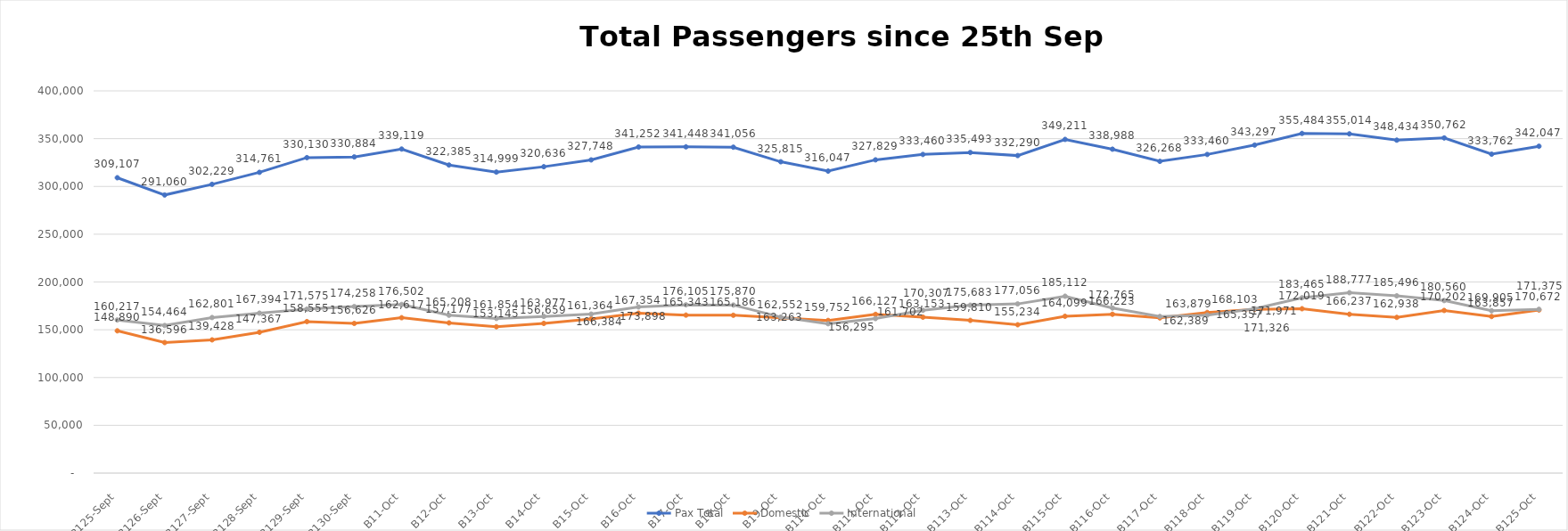
| Category | Pax Total | Domestic | International |
|---|---|---|---|
| 2023-09-25 | 309107 | 148890 | 160217 |
| 2023-09-26 | 291060 | 136596 | 154464 |
| 2023-09-27 | 302229 | 139428 | 162801 |
| 2023-09-28 | 314761 | 147367 | 167394 |
| 2023-09-29 | 330130 | 158555 | 171575 |
| 2023-09-30 | 330884 | 156626 | 174258 |
| 2023-10-01 | 339119 | 162617 | 176502 |
| 2023-10-02 | 322385 | 157177 | 165208 |
| 2023-10-03 | 314999 | 153145 | 161854 |
| 2023-10-04 | 320636 | 156659 | 163977 |
| 2023-10-05 | 327748 | 161364 | 166384 |
| 2023-10-06 | 341252 | 167354 | 173898 |
| 2023-10-07 | 341448 | 165343 | 176105 |
| 2023-10-08 | 341056 | 165186 | 175870 |
| 2023-10-09 | 325815 | 162552 | 163263 |
| 2023-10-10 | 316047 | 159752 | 156295 |
| 2023-10-11 | 327829 | 166127 | 161702 |
| 2023-10-12 | 333460 | 163153 | 170307 |
| 2023-10-13 | 335493 | 159810 | 175683 |
| 2023-10-14 | 332290 | 155234 | 177056 |
| 2023-10-15 | 349211 | 164099 | 185112 |
| 2023-10-16 | 338988 | 166223 | 172765 |
| 2023-10-17 | 326268 | 162389 | 163879 |
| 2023-10-18 | 333460 | 168103 | 165357 |
| 2023-10-19 | 343297 | 171326 | 171971 |
| 2023-10-20 | 355484 | 172019 | 183465 |
| 2023-10-21 | 355014 | 166237 | 188777 |
| 2023-10-22 | 348434 | 162938 | 185496 |
| 2023-10-23 | 350762 | 170202 | 180560 |
| 2023-10-24 | 333762 | 163857 | 169905 |
| 2023-10-25 | 342047 | 170672 | 171375 |